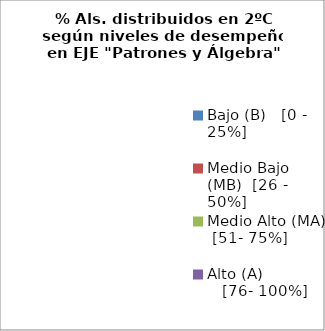
| Category | Series 0 |
|---|---|
| Bajo (B)   [0 - 25%] | 0 |
| Medio Bajo (MB)  [26 - 50%] | 0 |
| Medio Alto (MA)  [51- 75%] | 0 |
| Alto (A)                 [76- 100%] | 0 |